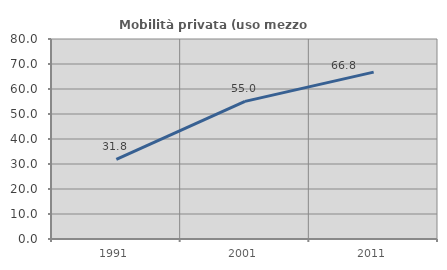
| Category | Mobilità privata (uso mezzo privato) |
|---|---|
| 1991.0 | 31.804 |
| 2001.0 | 55.039 |
| 2011.0 | 66.762 |